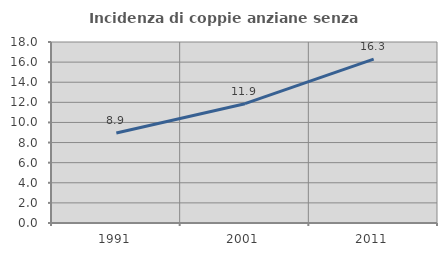
| Category | Incidenza di coppie anziane senza figli  |
|---|---|
| 1991.0 | 8.949 |
| 2001.0 | 11.867 |
| 2011.0 | 16.303 |